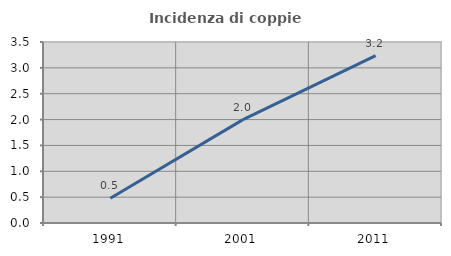
| Category | Incidenza di coppie miste |
|---|---|
| 1991.0 | 0.478 |
| 2001.0 | 1.999 |
| 2011.0 | 3.236 |